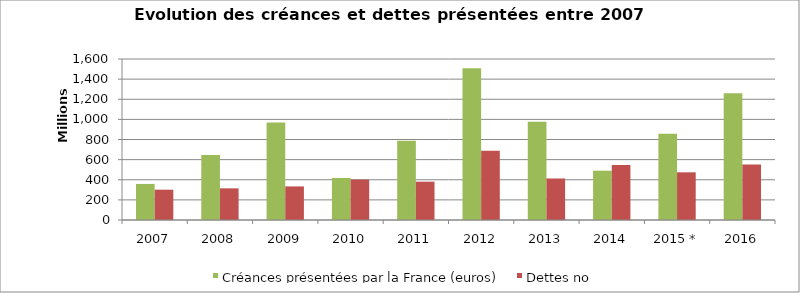
| Category | Créances présentées par la France (euros) | Dettes notifiées à la France (euros) |
|---|---|---|
| 2007 | 358430058.89 | 301289162.74 |
| 2008 | 646585718.72 | 314654939.76 |
| 2009 | 968006485.04 | 333718574.73 |
| 2010 | 417404895.55 | 401363839.64 |
| 2011 | 787958818.54 | 381119651.27 |
| 2012 | 1507677507.97 | 688133265.07 |
| 2013 | 977432189.69 | 412587470.248 |
| 2014 | 489966018.17 | 546663874.94 |
| 2015 * | 856258727.583 | 473886246.206 |
| 2016 | 1259499833.189 | 552482731.996 |